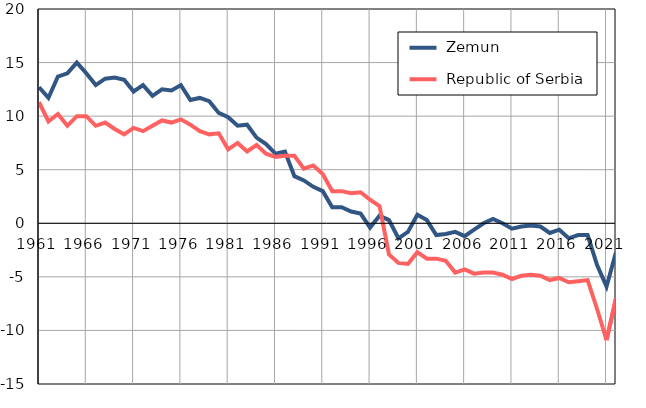
| Category |  Zemun |  Republic of Serbia |
|---|---|---|
| 1961.0 | 12.7 | 11.3 |
| 1962.0 | 11.7 | 9.5 |
| 1963.0 | 13.7 | 10.2 |
| 1964.0 | 14 | 9.1 |
| 1965.0 | 15 | 10 |
| 1966.0 | 14 | 10 |
| 1967.0 | 12.9 | 9.1 |
| 1968.0 | 13.5 | 9.4 |
| 1969.0 | 13.6 | 8.8 |
| 1970.0 | 13.4 | 8.3 |
| 1971.0 | 12.3 | 8.9 |
| 1972.0 | 12.9 | 8.6 |
| 1973.0 | 11.9 | 9.1 |
| 1974.0 | 12.5 | 9.6 |
| 1975.0 | 12.4 | 9.4 |
| 1976.0 | 12.9 | 9.7 |
| 1977.0 | 11.5 | 9.2 |
| 1978.0 | 11.7 | 8.6 |
| 1979.0 | 11.4 | 8.3 |
| 1980.0 | 10.3 | 8.4 |
| 1981.0 | 9.9 | 6.9 |
| 1982.0 | 9.1 | 7.5 |
| 1983.0 | 9.2 | 6.7 |
| 1984.0 | 8 | 7.3 |
| 1985.0 | 7.4 | 6.5 |
| 1986.0 | 6.5 | 6.2 |
| 1987.0 | 6.7 | 6.3 |
| 1988.0 | 4.4 | 6.3 |
| 1989.0 | 4 | 5.1 |
| 1990.0 | 3.4 | 5.4 |
| 1991.0 | 3 | 4.6 |
| 1992.0 | 1.5 | 3 |
| 1993.0 | 1.5 | 3 |
| 1994.0 | 1.1 | 2.8 |
| 1995.0 | 0.9 | 2.9 |
| 1996.0 | -0.4 | 2.2 |
| 1997.0 | 0.7 | 1.6 |
| 1998.0 | 0.3 | -2.9 |
| 1999.0 | -1.4 | -3.7 |
| 2000.0 | -0.8 | -3.8 |
| 2001.0 | 0.8 | -2.7 |
| 2002.0 | 0.3 | -3.3 |
| 2003.0 | -1.1 | -3.3 |
| 2004.0 | -1 | -3.5 |
| 2005.0 | -0.8 | -4.6 |
| 2006.0 | -1.2 | -4.3 |
| 2007.0 | -0.6 | -4.7 |
| 2008.0 | 0 | -4.6 |
| 2009.0 | 0.4 | -4.6 |
| 2010.0 | 0 | -4.8 |
| 2011.0 | -0.5 | -5.2 |
| 2012.0 | -0.3 | -4.9 |
| 2013.0 | -0.2 | -4.8 |
| 2014.0 | -0.3 | -4.9 |
| 2015.0 | -0.9 | -5.3 |
| 2016.0 | -0.6 | -5.1 |
| 2017.0 | -1.4 | -5.5 |
| 2018.0 | -1.1 | -5.4 |
| 2019.0 | -1.1 | -5.3 |
| 2020.0 | -3.9 | -8 |
| 2021.0 | -5.9 | -10.9 |
| 2022.0 | -2.7 | -7 |